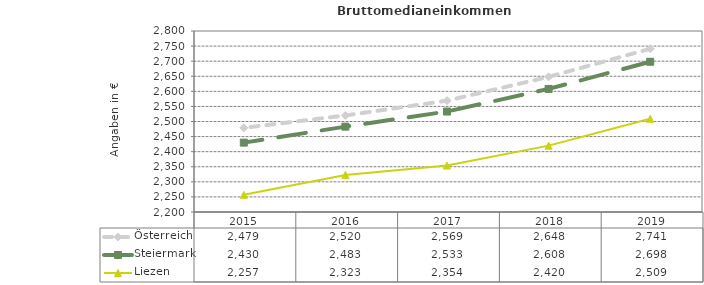
| Category | Österreich | Steiermark | Liezen |
|---|---|---|---|
| 2019.0 | 2741 | 2698 | 2509 |
| 2018.0 | 2648 | 2608 | 2420 |
| 2017.0 | 2569 | 2533 | 2354 |
| 2016.0 | 2520 | 2483 | 2323 |
| 2015.0 | 2479 | 2430 | 2257 |